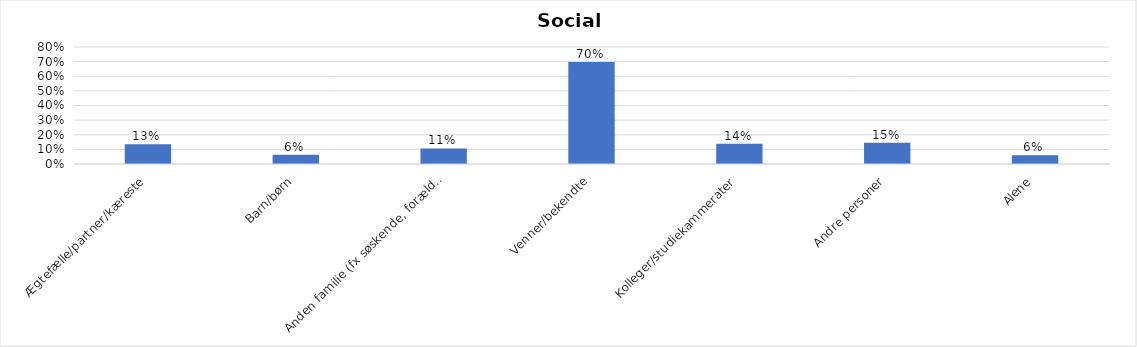
| Category | % |
|---|---|
| Ægtefælle/partner/kæreste | 0.134 |
| Barn/børn | 0.063 |
| Anden familie (fx søskende, forældre) | 0.107 |
| Venner/bekendte | 0.698 |
| Kolleger/studiekammerater | 0.138 |
| Andre personer | 0.146 |
| Alene | 0.059 |